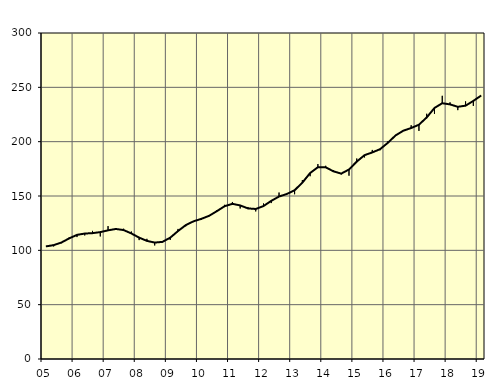
| Category | Trend | Säsongrensat |
|---|---|---|
| 5.0 | 103.62 | 103.7 |
| nan | 104.8 | 103.6 |
| 6.0 | 107.2 | 106.6 |
| 6.0 | 111.01 | 111.9 |
| 6.0 | 114.23 | 112.2 |
| nan | 115.44 | 113.7 |
| 7.0 | 115.82 | 117.9 |
| 7.0 | 116.78 | 112.8 |
| 7.0 | 118.4 | 122.3 |
| nan | 119.66 | 120 |
| 8.0 | 118.66 | 119.9 |
| 8.0 | 115.53 | 117.3 |
| 8.0 | 111.69 | 109.4 |
| nan | 108.7 | 110.6 |
| 9.0 | 107.14 | 104.5 |
| 9.0 | 107.79 | 107.4 |
| 9.0 | 111.66 | 109.6 |
| nan | 117.73 | 119.7 |
| 10.0 | 123.24 | 122.1 |
| 10.0 | 126.71 | 126.1 |
| 10.0 | 128.96 | 128.1 |
| nan | 131.76 | 131.9 |
| 11.0 | 136.05 | 136.9 |
| 11.0 | 140.62 | 141.9 |
| 11.0 | 142.78 | 144.5 |
| nan | 141.33 | 138.5 |
| 12.0 | 138.59 | 139.9 |
| 12.0 | 138.06 | 135.8 |
| 12.0 | 140.74 | 143.1 |
| nan | 145.53 | 143.5 |
| 13.0 | 149.53 | 153.2 |
| 13.0 | 151.84 | 152 |
| 13.0 | 155.29 | 151.6 |
| nan | 162.27 | 164.7 |
| 14.0 | 171.16 | 168.2 |
| 14.0 | 176.47 | 179.4 |
| 14.0 | 176.38 | 177.8 |
| nan | 172.72 | 173.6 |
| 15.0 | 170.6 | 170 |
| 15.0 | 174.39 | 168.7 |
| 15.0 | 181.65 | 184.5 |
| nan | 187.59 | 185.5 |
| 16.0 | 190.1 | 192.4 |
| 16.0 | 193.1 | 192.1 |
| 16.0 | 198.95 | 200.3 |
| nan | 205.78 | 205.7 |
| 17.0 | 210.13 | 209.9 |
| 17.0 | 212.53 | 215.1 |
| 17.0 | 215.61 | 209.9 |
| nan | 222.29 | 225.7 |
| 18.0 | 231.02 | 225.6 |
| 18.0 | 235.38 | 242.2 |
| 18.0 | 234.29 | 236.2 |
| nan | 232.08 | 229 |
| 19.0 | 233.13 | 237.1 |
| 19.0 | 237.51 | 232.9 |
| 19.0 | 242.41 | 242.5 |